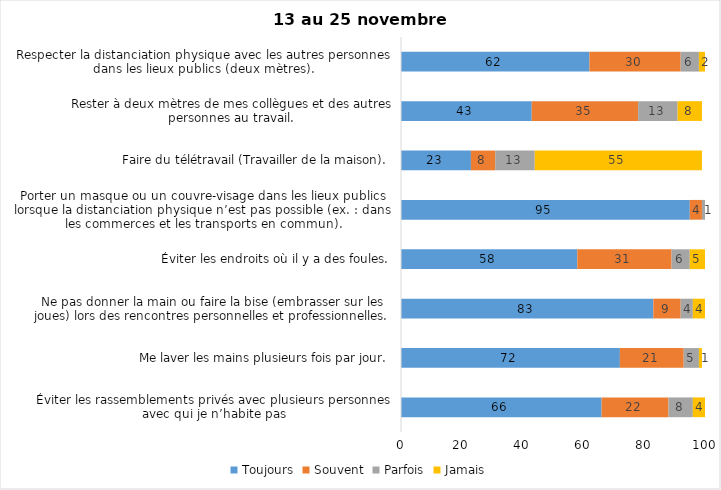
| Category | Toujours | Souvent | Parfois | Jamais |
|---|---|---|---|---|
| Éviter les rassemblements privés avec plusieurs personnes avec qui je n’habite pas | 66 | 22 | 8 | 4 |
| Me laver les mains plusieurs fois par jour. | 72 | 21 | 5 | 1 |
| Ne pas donner la main ou faire la bise (embrasser sur les joues) lors des rencontres personnelles et professionnelles. | 83 | 9 | 4 | 4 |
| Éviter les endroits où il y a des foules. | 58 | 31 | 6 | 5 |
| Porter un masque ou un couvre-visage dans les lieux publics lorsque la distanciation physique n’est pas possible (ex. : dans les commerces et les transports en commun). | 95 | 4 | 1 | 0 |
| Faire du télétravail (Travailler de la maison). | 23 | 8 | 13 | 55 |
| Rester à deux mètres de mes collègues et des autres personnes au travail. | 43 | 35 | 13 | 8 |
| Respecter la distanciation physique avec les autres personnes dans les lieux publics (deux mètres). | 62 | 30 | 6 | 2 |